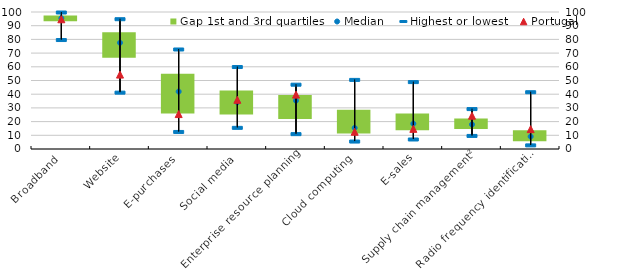
| Category | 1st quartile | Gap 1st and 3rd quartiles |
|---|---|---|
| Broadband | 93.9 | 3.5 |
| Website | 67.3 | 17.9 |
| E-purchases | 26.6 | 28.3 |
| Social media | 26 | 16.7 |
| Enterprise resource planning | 22.7 | 16.7 |
| Cloud computing | 12 | 16.7 |
| E-sales | 14.4 | 11.5 |
| Supply chain management² | 15.4 | 6.9 |
| Radio frequency identification | 6.4 | 7.2 |